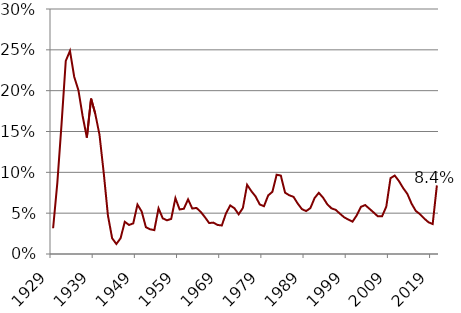
| Category | Series 0 |
|---|---|
| 1929.0 | 0.032 |
| 1930.0 | 0.087 |
| 1931.0 | 0.159 |
| 1932.0 | 0.236 |
| 1933.0 | 0.249 |
| 1934.0 | 0.217 |
| 1935.0 | 0.201 |
| 1936.0 | 0.169 |
| 1937.0 | 0.143 |
| 1938.0 | 0.19 |
| 1939.0 | 0.172 |
| 1940.0 | 0.146 |
| 1941.0 | 0.099 |
| 1942.0 | 0.047 |
| 1943.0 | 0.019 |
| 1944.0 | 0.012 |
| 1945.0 | 0.019 |
| 1946.0 | 0.039 |
| 1947.0 | 0.036 |
| 1948.0 | 0.038 |
| 1949.0 | 0.06 |
| 1950.0 | 0.052 |
| 1951.0 | 0.033 |
| 1952.0 | 0.03 |
| 1953.0 | 0.029 |
| 1954.0 | 0.056 |
| 1955.0 | 0.044 |
| 1956.0 | 0.041 |
| 1957.0 | 0.043 |
| 1958.0 | 0.068 |
| 1959.0 | 0.054 |
| 1960.0 | 0.055 |
| 1961.0 | 0.067 |
| 1962.0 | 0.056 |
| 1963.0 | 0.056 |
| 1964.0 | 0.052 |
| 1965.0 | 0.045 |
| 1966.0 | 0.038 |
| 1967.0 | 0.038 |
| 1968.0 | 0.036 |
| 1969.0 | 0.035 |
| 1970.0 | 0.05 |
| 1971.0 | 0.06 |
| 1972.0 | 0.056 |
| 1973.0 | 0.049 |
| 1974.0 | 0.056 |
| 1975.0 | 0.085 |
| 1976.0 | 0.077 |
| 1977.0 | 0.07 |
| 1978.0 | 0.061 |
| 1979.0 | 0.058 |
| 1980.0 | 0.072 |
| 1981.0 | 0.076 |
| 1982.0 | 0.097 |
| 1983.0 | 0.096 |
| 1984.0 | 0.075 |
| 1985.0 | 0.072 |
| 1986.0 | 0.07 |
| 1987.0 | 0.062 |
| 1988.0 | 0.055 |
| 1989.0 | 0.053 |
| 1990.0 | 0.056 |
| 1991.0 | 0.068 |
| 1992.0 | 0.075 |
| 1993.0 | 0.069 |
| 1994.0 | 0.061 |
| 1995.0 | 0.056 |
| 1996.0 | 0.054 |
| 1997.0 | 0.049 |
| 1998.0 | 0.045 |
| 1999.0 | 0.042 |
| 2000.0 | 0.04 |
| 2001.0 | 0.047 |
| 2002.0 | 0.058 |
| 2003.0 | 0.06 |
| 2004.0 | 0.055 |
| 2005.0 | 0.051 |
| 2006.0 | 0.046 |
| 2007.0 | 0.046 |
| 2008.0 | 0.058 |
| 2009.0 | 0.093 |
| 2010.0 | 0.096 |
| 2011.0 | 0.089 |
| 2012.0 | 0.081 |
| 2013.0 | 0.074 |
| 2014.0 | 0.062 |
| 2015.0 | 0.053 |
| 2016.0 | 0.049 |
| 2017.0 | 0.043 |
| 2018.0 | 0.039 |
| 2019.0 | 0.037 |
| 2020.0 | 0.084 |